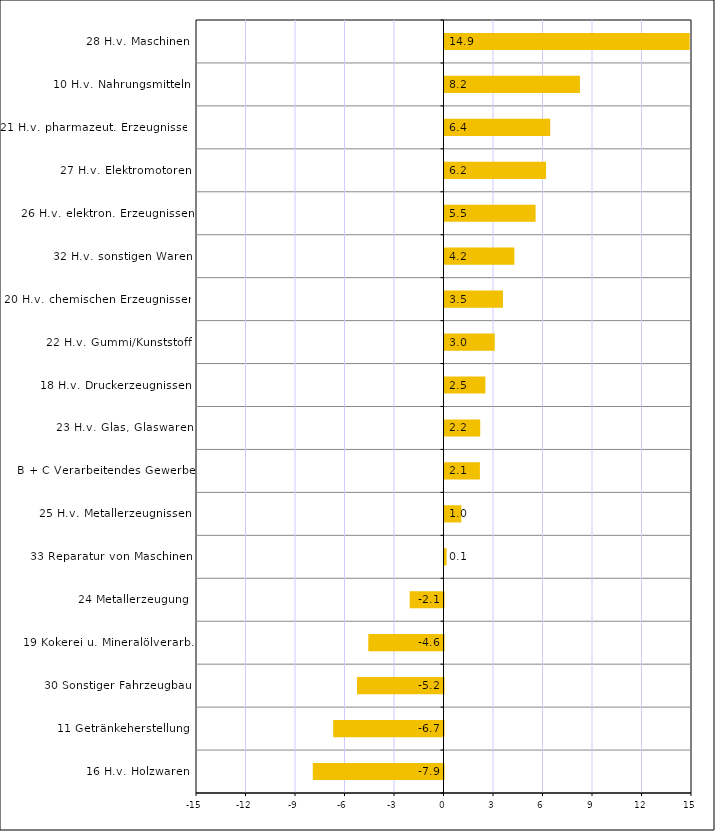
| Category | Series 0 |
|---|---|
| 16 H.v. Holzwaren | -7.921 |
| 11 Getränkeherstellung | -6.686 |
| 30 Sonstiger Fahrzeugbau | -5.24 |
| 19 Kokerei u. Mineralölverarb. | -4.558 |
| 24 Metallerzeugung | -2.051 |
| 33 Reparatur von Maschinen | 0.125 |
| 25 H.v. Metallerzeugnissen | 1.022 |
| B + C Verarbeitendes Gewerbe | 2.146 |
| 23 H.v. Glas, Glaswaren | 2.165 |
| 18 H.v. Druckerzeugnissen | 2.478 |
| 22 H.v. Gummi/Kunststoff | 3.046 |
| 20 H.v. chemischen Erzeugnissen | 3.543 |
| 32 H.v. sonstigen Waren | 4.235 |
| 26 H.v. elektron. Erzeugnissen | 5.522 |
| 27 H.v. Elektromotoren | 6.156 |
| 21 H.v. pharmazeut. Erzeugnissen | 6.406 |
| 10 H.v. Nahrungsmitteln | 8.207 |
| 28 H.v. Maschinen | 14.859 |